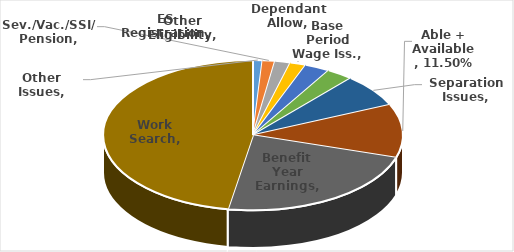
| Category | Series 0 |
|---|---|
| Other Issues | 0.01 |
| Sev./Vac./SSI/ Pension | 0.013 |
| Other Eligibility | 0.017 |
| Base Period Wage Iss. | 0.017 |
| Dependant Allow | 0.027 |
| ES Registration | 0.029 |
| Separation Issues | 0.071 |
| Able + Available | 0.115 |
| Benefit Year Earnings | 0.228 |
| Work Search | 0.473 |